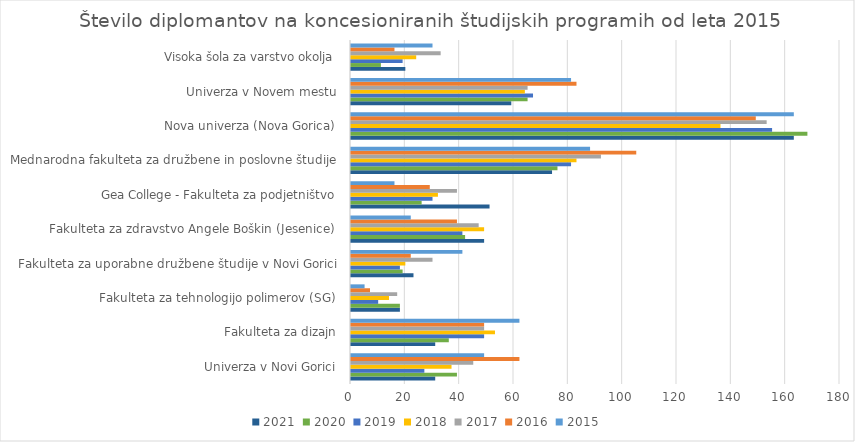
| Category | 2021 | 2020 | 2019 | 2018 | 2017 | 2016 | 2015 |
|---|---|---|---|---|---|---|---|
| Univerza v Novi Gorici | 31 | 39 | 27 | 37 | 45 | 62 | 49 |
| Fakulteta za dizajn | 31 | 36 | 49 | 53 | 49 | 49 | 62 |
| Fakulteta za tehnologijo polimerov (SG) | 18 | 18 | 10 | 14 | 17 | 7 | 5 |
| Fakulteta za uporabne družbene študije v Novi Gorici | 23 | 19 | 18 | 20 | 30 | 22 | 41 |
| Fakulteta za zdravstvo Angele Boškin (Jesenice) | 49 | 42 | 41 | 49 | 47 | 39 | 22 |
| Gea College - Fakulteta za podjetništvo | 51 | 26 | 30 | 32 | 39 | 29 | 16 |
| Mednarodna fakulteta za družbene in poslovne študije | 74 | 76 | 81 | 83 | 92 | 105 | 88 |
| Nova univerza (Nova Gorica) | 163 | 168 | 155 | 136 | 153 | 149 | 163 |
| Univerza v Novem mestu | 59 | 65 | 67 | 64 | 65 | 83 | 81 |
| Visoka šola za varstvo okolja | 20 | 11 | 19 | 24 | 33 | 16 | 30 |